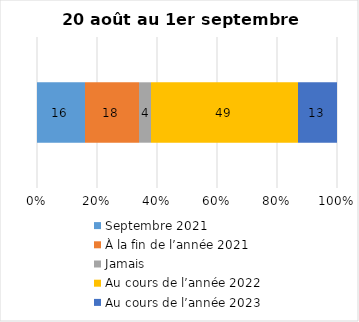
| Category | Septembre 2021 | À la fin de l’année 2021 | Jamais | Au cours de l’année 2022 | Au cours de l’année 2023 |
|---|---|---|---|---|---|
| 0 | 16 | 18 | 4 | 49 | 13 |